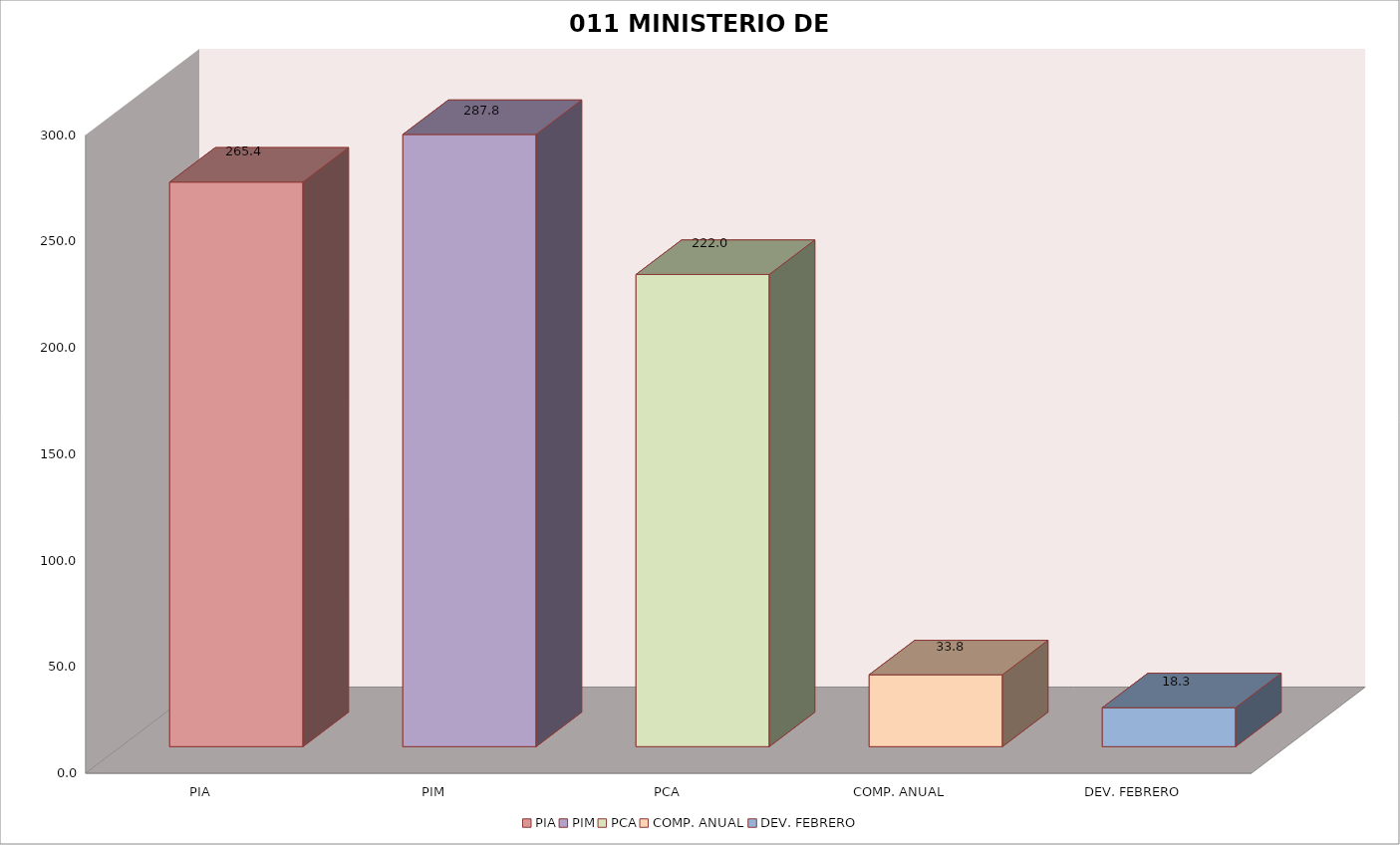
| Category | 011 MINISTERIO DE SALUD |
|---|---|
| PIA | 265.378 |
| PIM | 287.769 |
| PCA | 221.952 |
| COMP. ANUAL | 33.794 |
| DEV. FEBRERO | 18.319 |